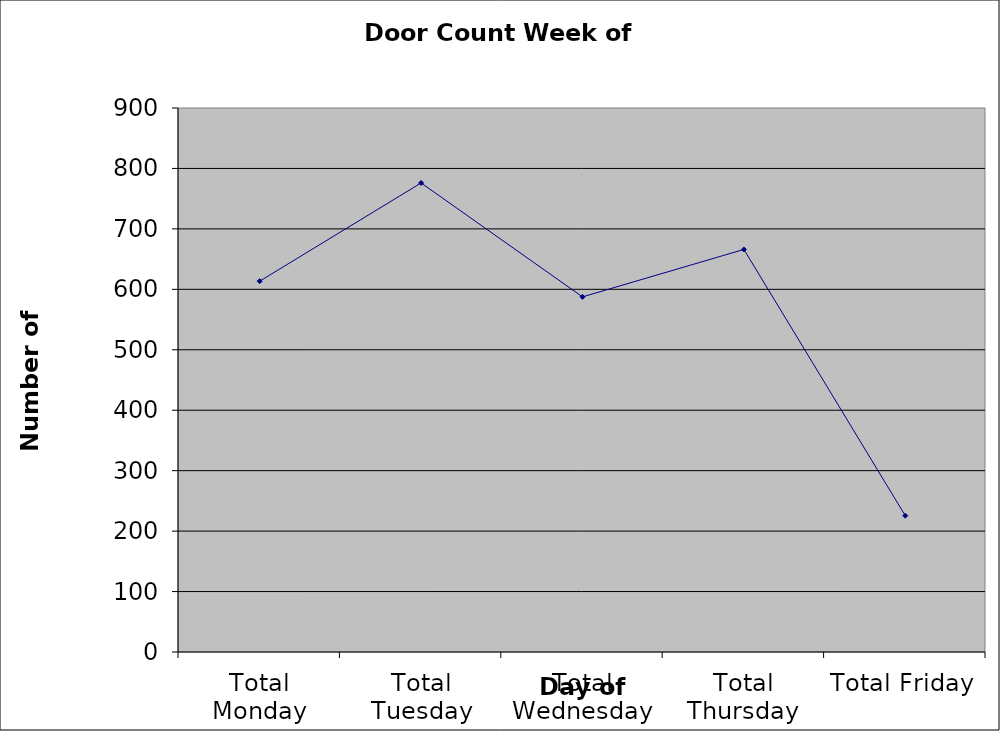
| Category | Series 0 |
|---|---|
| Total Monday | 613.5 |
| Total Tuesday | 776 |
| Total Wednesday | 587.5 |
| Total Thursday | 666 |
| Total Friday | 225.5 |